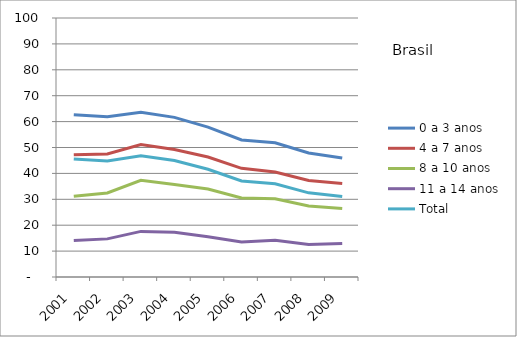
| Category | 0 a 3 anos | 4 a 7 anos | 8 a 10 anos | 11 a 14 anos | Total |
|---|---|---|---|---|---|
| 2001.0 | 62.61 | 47.21 | 31.21 | 14.11 | 45.6 |
| 2002.0 | 61.83 | 47.52 | 32.44 | 14.72 | 44.81 |
| 2003.0 | 63.57 | 51.11 | 37.35 | 17.61 | 46.84 |
| 2004.0 | 61.64 | 49.24 | 35.73 | 17.29 | 44.95 |
| 2005.0 | 57.88 | 46.33 | 34 | 15.58 | 41.6 |
| 2006.0 | 52.92 | 41.96 | 30.49 | 13.52 | 37.07 |
| 2007.0 | 51.84 | 40.55 | 30.21 | 14.17 | 36 |
| 2008.0 | 47.87 | 37.25 | 27.43 | 12.57 | 32.5 |
| 2009.0 | 45.93 | 36.11 | 26.41 | 12.9 | 31.1 |